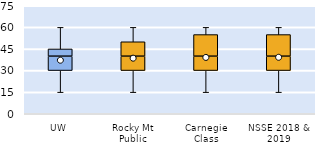
| Category | 25th | 50th | 75th |
|---|---|---|---|
| UW | 30 | 10 | 5 |
| Rocky Mt Public | 30 | 10 | 10 |
| Carnegie Class | 30 | 10 | 15 |
| NSSE 2018 & 2019 | 30 | 10 | 15 |